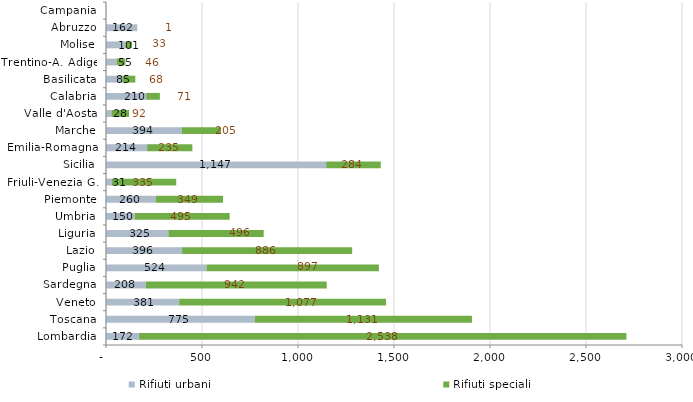
| Category | Rifiuti urbani | Rifiuti speciali |
|---|---|---|
| Lombardia | 172.481 | 2538.151 |
| Toscana | 774.908 | 1131.012 |
| Veneto | 381.263 | 1077.312 |
| Sardegna | 208.049 | 941.702 |
| Puglia | 523.936 | 897.182 |
| Lazio | 396.212 | 885.842 |
| Liguria | 325.225 | 495.952 |
| Umbria | 149.516 | 494.788 |
| Piemonte | 260.184 | 349.202 |
| Friuli-Venezia G. | 31.278 | 334.534 |
| Sicilia | 1146.712 | 284.461 |
| Emilia-Romagna | 214.205 | 235.451 |
| Marche | 393.658 | 205.407 |
| Valle d'Aosta | 28.337 | 91.862 |
| Calabria | 209.646 | 71.017 |
| Basilicata | 85.013 | 67.629 |
| Trentino-A. Adige | 54.974 | 45.984 |
| Molise | 101.381 | 33.331 |
| Abruzzo | 161.662 | 0.814 |
| Campania | 0 | 0 |